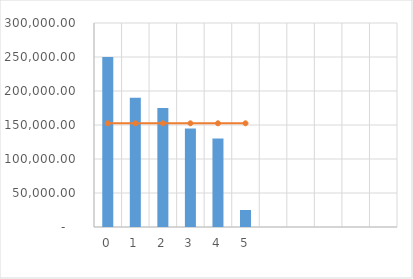
| Category | Series 0 |
|---|---|
| 0 | 250000 |
| 1 | 190000 |
| 2 | 175000 |
| 3 | 145000 |
| 4 | 130000 |
| 5 | 25000 |